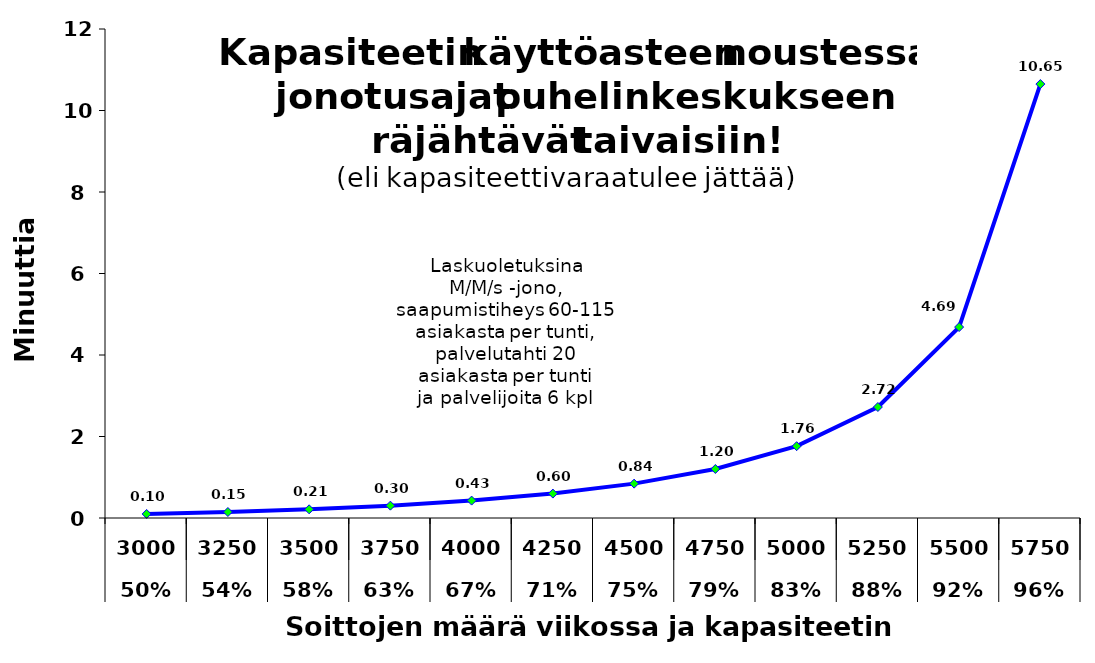
| Category | Series 0 |
|---|---|
| 0 | 0.099 |
| 1 | 0.147 |
| 2 | 0.213 |
| 3 | 0.303 |
| 4 | 0.427 |
| 5 | 0.599 |
| 6 | 0.843 |
| 7 | 1.202 |
| 8 | 1.763 |
| 9 | 2.724 |
| 10 | 4.686 |
| 11 | 10.649 |